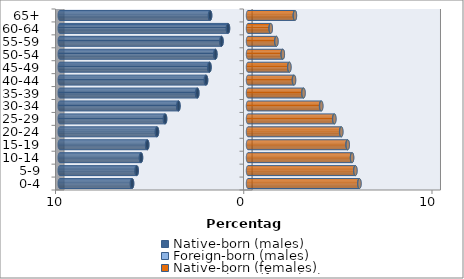
| Category | Native-born (males) | Foreign-born (males) | Native-born (females) | Foreign-born (females) |
|---|---|---|---|---|
| 0-4 | -6.157 | -0.016 | 5.914 | 0.01 |
| 5-9 | -5.911 | -0.012 | 5.7 | 0.008 |
| 10-14 | -5.682 | -0.01 | 5.524 | 0.008 |
| 15-19 | -5.351 | -0.011 | 5.288 | 0.01 |
| 20-24 | -4.833 | -0.013 | 4.947 | 0.014 |
| 25-29 | -4.403 | -0.017 | 4.577 | 0.016 |
| 30-34 | -3.693 | -0.021 | 3.881 | 0.017 |
| 35-39 | -2.691 | -0.022 | 2.938 | 0.016 |
| 40-44 | -2.226 | -0.022 | 2.437 | 0.014 |
| 45-49 | -2.044 | -0.019 | 2.19 | 0.011 |
| 50-54 | -1.73 | -0.015 | 1.842 | 0.01 |
| 55-59 | -1.406 | -0.012 | 1.504 | 0.008 |
| 60-64 | -1.061 | -0.01 | 1.203 | 0.007 |
| 65+ | -2.012 | -0.01 | 2.489 | 0.007 |